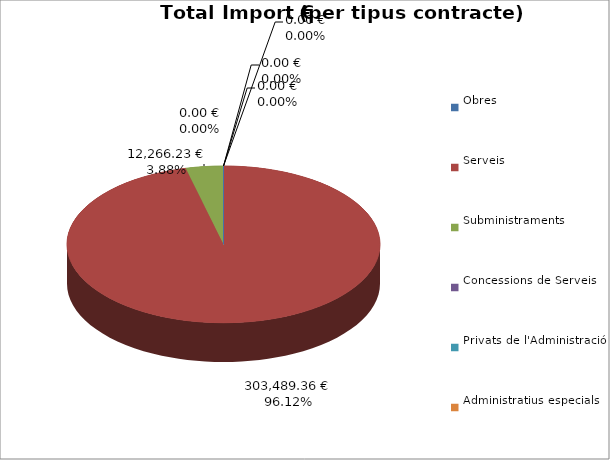
| Category | Total preu
(amb IVA) |
|---|---|
| Obres | 0 |
| Serveis | 303489.36 |
| Subministraments | 12266.23 |
| Concessions de Serveis | 0 |
| Privats de l'Administració | 0 |
| Administratius especials | 0 |